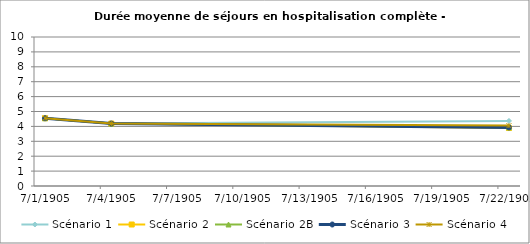
| Category | Scénario 1 | Scénario 2 | Scénario 2B | Scénario 3 | Scénario 4 |
|---|---|---|---|---|---|
| 2009.0 | 4.548 | 4.548 | 4.548 | 4.548 | 4.548 |
| 2012.0 | 4.191 | 4.191 | 4.191 | 4.191 | 4.191 |
| 2030.0 | 4.367 | 3.891 | 3.933 | 3.933 | 4.052 |